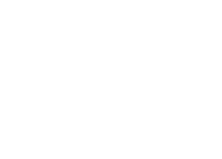
| Category | f | Series 1 |
|---|---|---|
| Dalam Negara | 0 |  |
| Luar Negara | 0 |  |
| Tiada Jawapan | 0 |  |